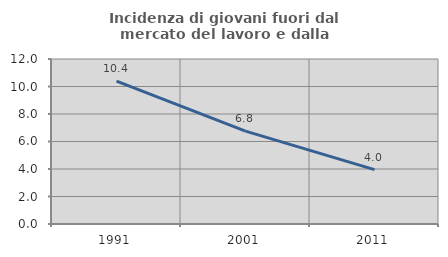
| Category | Incidenza di giovani fuori dal mercato del lavoro e dalla formazione  |
|---|---|
| 1991.0 | 10.391 |
| 2001.0 | 6.757 |
| 2011.0 | 3.954 |